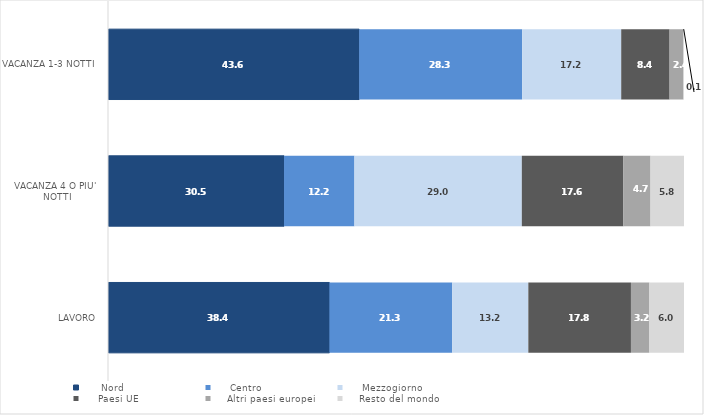
| Category |       Nord |      Centro |      Mezzogiorno |      Paesi UE |     Altri paesi europei |     Resto del mondo |
|---|---|---|---|---|---|---|
| VACANZA 1-3 NOTTI | 43.6 | 28.3 | 17.2 | 8.4 | 2.4 | 0.1 |
| VACANZA 4 O PIU' NOTTI | 30.5 | 12.2 | 29 | 17.6 | 4.7 | 5.8 |
| LAVORO | 38.4 | 21.3 | 13.2 | 17.8 | 3.2 | 6 |